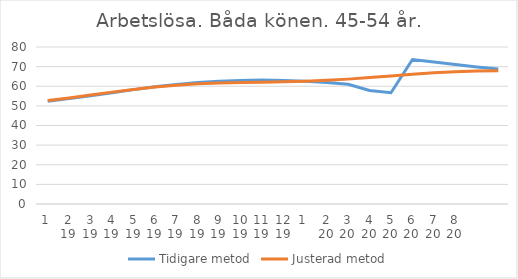
| Category | Tidigare metod | Justerad metod |
|---|---|---|
| 0 | 52.41 | 52.69 |
| 1 | 53.69 | 54.07 |
| 2 | 55.16 | 55.54 |
| 3 | 56.72 | 57 |
| 4 | 58.28 | 58.4 |
| 5 | 59.71 | 59.62 |
| 6 | 60.89 | 60.56 |
| 7 | 61.85 | 61.23 |
| 8 | 62.55 | 61.66 |
| 9 | 62.98 | 61.91 |
| 10 | 63.14 | 62.1 |
| 11 | 62.99 | 62.29 |
| 12 | 62.53 | 62.55 |
| 13 | 61.85 | 63 |
| 14 | 60.97 | 63.63 |
| 15 | 57.83 | 64.4 |
| 16 | 56.67 | 65.26 |
| 17 | 73.64 | 66.11 |
| 18 | 72.36 | 66.86 |
| 19 | 71.05 | 67.41 |
| 20 | 69.83 | 67.76 |
| 21 | 68.77 | 67.9 |